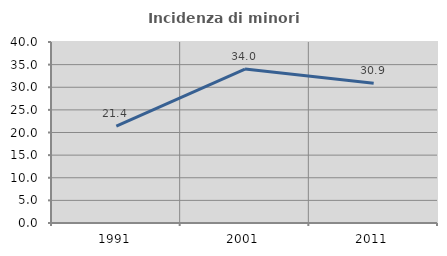
| Category | Incidenza di minori stranieri |
|---|---|
| 1991.0 | 21.429 |
| 2001.0 | 34.01 |
| 2011.0 | 30.891 |